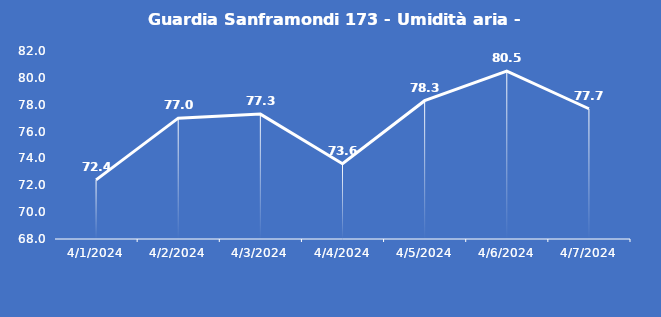
| Category | Guardia Sanframondi 173 - Umidità aria - Grezzo (%) |
|---|---|
| 4/1/24 | 72.4 |
| 4/2/24 | 77 |
| 4/3/24 | 77.3 |
| 4/4/24 | 73.6 |
| 4/5/24 | 78.3 |
| 4/6/24 | 80.5 |
| 4/7/24 | 77.7 |